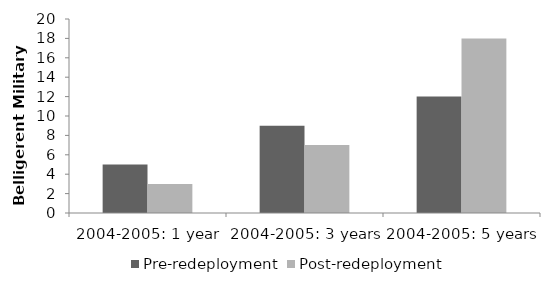
| Category | Pre-redeployment | Post-redeployment |
|---|---|---|
| 2004-2005: 1 year | 5 | 3 |
| 2004-2005: 3 years | 9 | 7 |
| 2004-2005: 5 years | 12 | 18 |